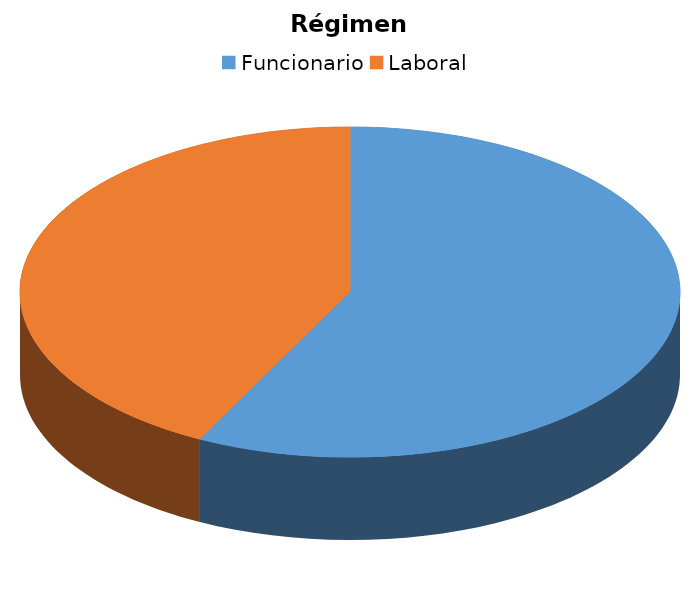
| Category | Régimen Jurídico |
|---|---|
| Funcionario | 111 |
| Laboral | 82 |